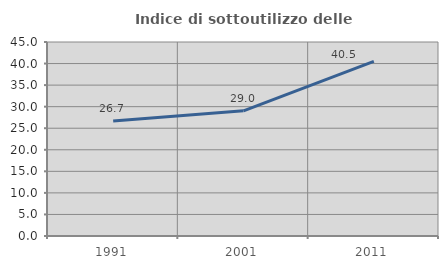
| Category | Indice di sottoutilizzo delle abitazioni  |
|---|---|
| 1991.0 | 26.701 |
| 2001.0 | 29.043 |
| 2011.0 | 40.517 |